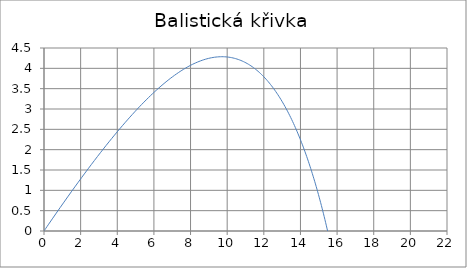
| Category | y |
|---|---|
| 0.0 | 0 |
| 0.23022917062329243 | 0.152 |
| 0.4541070226602385 | 0.299 |
| 0.671991292291787 | 0.44 |
| 0.8842103542382591 | 0.577 |
| 1.091066366301379 | 0.71 |
| 1.2928380016761116 | 0.839 |
| 1.4897828324782796 | 0.963 |
| 1.6821394167884418 | 1.083 |
| 1.8701291325561664 | 1.2 |
| 2.053957794468319 | 1.314 |
| 2.233817083998276 | 1.423 |
| 2.4098858180411296 | 1.53 |
| 2.5823310775866117 | 1.633 |
| 2.751309214617688 | 1.733 |
| 2.9169667527158323 | 1.831 |
| 3.0794411945990174 | 1.925 |
| 3.2388617479321256 | 2.017 |
| 3.3953499791651685 | 2.106 |
| 3.5490204038190356 | 2.192 |
| 3.699981020508245 | 2.276 |
| 3.8483337950304803 | 2.358 |
| 3.994175100035027 | 2.437 |
| 4.1375961150833644 | 2.514 |
| 4.2786831913159755 | 2.589 |
| 4.417518184424185 | 2.661 |
| 4.554178759181516 | 2.731 |
| 4.688738668404803 | 2.8 |
| 4.821268008882178 | 2.866 |
| 4.9518334565154625 | 2.93 |
| 5.08049848267215 | 2.993 |
| 5.20732355352181 | 3.053 |
| 5.332366313938749 | 3.112 |
| 5.455681757383505 | 3.169 |
| 5.577322383026915 | 3.224 |
| 5.697338341249322 | 3.277 |
| 5.815777568531718 | 3.329 |
| 5.932685912653217 | 3.379 |
| 6.048107249018476 | 3.428 |
| 6.162083588858102 | 3.474 |
| 6.274655179973434 | 3.52 |
| 6.385860600633203 | 3.564 |
| 6.495736847172645 | 3.606 |
| 6.604319415794664 | 3.647 |
| 6.711642379027082 | 3.686 |
| 6.817738457249125 | 3.724 |
| 6.922639085663589 | 3.76 |
| 7.026374477058126 | 3.796 |
| 7.1289736806693735 | 3.829 |
| 7.230464637436858 | 3.862 |
| 7.330874231909404 | 3.893 |
| 7.430228341044904 | 3.923 |
| 7.528551880124528 | 3.951 |
| 7.625868845984485 | 3.978 |
| 7.722202357752175 | 4.004 |
| 7.8175746952588065 | 4.029 |
| 7.912007335287051 | 4.053 |
| 8.005520985800116 | 4.075 |
| 8.09813561828741 | 4.096 |
| 8.189870498351814 | 4.116 |
| 8.280744214654243 | 4.135 |
| 8.370774706322694 | 4.152 |
| 8.459979288925165 | 4.169 |
| 8.548374679098695 | 4.184 |
| 8.635977017920204 | 4.198 |
| 8.722801893098856 | 4.211 |
| 8.808864360064012 | 4.223 |
| 8.894178962017898 | 4.234 |
| 8.978759749017268 | 4.244 |
| 9.062620296144118 | 4.253 |
| 9.145773720821454 | 4.26 |
| 9.228232699326412 | 4.267 |
| 9.310009482549631 | 4.273 |
| 9.391115911046565 | 4.277 |
| 9.471563429423492 | 4.281 |
| 9.551363100098222 | 4.284 |
| 9.630525616472967 | 4.285 |
| 9.70906131555443 | 4.286 |
| 9.786980190053978 | 4.285 |
| 9.864291899998642 | 4.284 |
| 9.941005783881812 | 4.282 |
| 10.017130869380583 | 4.278 |
| 10.092675883665091 | 4.274 |
| 10.167649263323483 | 4.269 |
| 10.24205916392472 | 4.263 |
| 10.315913469239948 | 4.256 |
| 10.38921980014185 | 4.247 |
| 10.461985523200108 | 4.239 |
| 10.534217758989909 | 4.229 |
| 10.605923390129332 | 4.218 |
| 10.677109069060304 | 4.206 |
| 10.747781225586898 | 4.194 |
| 10.817946074183716 | 4.18 |
| 10.887609621086224 | 4.166 |
| 10.956777671174043 | 4.151 |
| 11.025455834657416 | 4.135 |
| 11.09364953357624 | 4.118 |
| 11.16136400812043 | 4.1 |
| 11.228604322779606 | 4.081 |
| 11.295375372329529 | 4.062 |
| 11.36168188766205 | 4.041 |
| 11.427528441464847 | 4.02 |
| 11.49291945375663 | 3.998 |
| 11.557859197283022 | 3.975 |
| 11.622351802777914 | 3.951 |
| 11.686401264094597 | 3.927 |
| 11.750011443210635 | 3.901 |
| 11.81318607511007 | 3.875 |
| 11.8759287725462 | 3.848 |
| 11.938243030687897 | 3.821 |
| 12.00013223165215 | 3.792 |
| 12.061599648925261 | 3.763 |
| 12.122648451674893 | 3.733 |
| 12.183281708955016 | 3.702 |
| 12.243502393805565 | 3.67 |
| 12.3033133872485 | 3.638 |
| 12.362717482181809 | 3.605 |
| 12.421717387172922 | 3.571 |
| 12.480315730152826 | 3.536 |
| 12.538515062012175 | 3.501 |
| 12.596317860100566 | 3.464 |
| 12.65372653163012 | 3.427 |
| 12.710743416984473 | 3.39 |
| 12.767370792934221 | 3.352 |
| 12.823610875759908 | 3.312 |
| 12.879465824283532 | 3.273 |
| 12.93493774280968 | 3.232 |
| 12.990028683977258 | 3.191 |
| 13.044740651522915 | 3.149 |
| 13.099075602957205 | 3.106 |
| 13.153035452154578 | 3.063 |
| 13.206622071858297 | 3.019 |
| 13.259837296101422 | 2.975 |
| 13.312682922545013 | 2.929 |
| 13.365160714734747 | 2.883 |
| 13.417272404277155 | 2.837 |
| 13.469019692936719 | 2.789 |
| 13.520404254655134 | 2.742 |
| 13.571427737493993 | 2.693 |
| 13.622091765502256 | 2.644 |
| 13.67239794050985 | 2.594 |
| 13.722347843848778 | 2.543 |
| 13.771943038003146 | 2.492 |
| 13.821185068189521 | 2.441 |
| 13.87007546386909 | 2.388 |
| 13.918615740193044 | 2.335 |
| 13.966807399382693 | 2.282 |
| 14.014651932045807 | 2.228 |
| 14.062150818430627 | 2.173 |
| 14.109305529619137 | 2.118 |
| 14.156117528661035 | 2.062 |
| 14.202588271649965 | 2.005 |
| 14.248719208743514 | 1.948 |
| 14.294511785128485 | 1.891 |
| 14.33996744193298 | 1.833 |
| 14.385087617086782 | 1.774 |
| 14.429873746131562 | 1.715 |
| 14.474327262982385 | 1.655 |
| 14.518449600642018 | 1.595 |
| 14.562242191869505 | 1.534 |
| 14.605706469804476 | 1.472 |
| 14.64884386854862 | 1.41 |
| 14.691655823705787 | 1.348 |
| 14.73414377288208 | 1.285 |
| 14.776309156147375 | 1.222 |
| 14.818153416459635 | 1.158 |
| 14.859678000053346 | 1.093 |
| 14.900884356793439 | 1.028 |
| 14.941773940495985 | 0.963 |
| 14.982348209216964 | 0.897 |
| 15.022608625510372 | 0.831 |
| 15.062556656656884 | 0.764 |
| 15.102193774864313 | 0.697 |
| 15.141521457441034 | 0.629 |
| 15.180541186943552 | 0.561 |
| 15.219254451299339 | 0.492 |
| 15.257662743906053 | 0.423 |
| 15.295767563708223 | 0.354 |
| 15.333570415252465 | 0.284 |
| 15.37107280872225 | 0.214 |
| 15.408276259953238 | 0.143 |
| 15.445182290430148 | 0.072 |
| 15.481792427266113 | 0 |
| 15.518108203165465 | -0.072 |
| 15.554131156370815 | -0.144 |
| 15.589862830595333 | -0.217 |
| 15.625304774941052 | -0.29 |
| 15.66045854380403 | -0.364 |
| 15.695325696767151 | -0.438 |
| 15.729907798481348 | -0.512 |
| 15.76420641853598 | -0.587 |
| 15.798223131319109 | -0.662 |
| 15.831959515868318 | -0.737 |
| 15.865417155712818 | -0.813 |
| 15.898597638707416 | -0.889 |
| 15.931502556859026 | -0.966 |
| 15.964133506146293 | -1.043 |
| 15.99649208633292 | -1.12 |
| 16.028579900775252 | -1.197 |
| 16.060398556224673 | -1.275 |
| 16.091949662625286 | -1.353 |
| 16.12323483290743 | -1.432 |
| 16.15425568277745 | -1.511 |
| 16.18501383050422 | -1.59 |
| 16.215510896702835 | -1.669 |
| 16.245748504115866 | -1.749 |
| 16.275728277392645 | -1.829 |
| 16.30545184286687 | -1.909 |
| 16.334920828332955 | -1.99 |
| 16.36413686282147 | -2.071 |
| 16.393101576373972 | -2.152 |
| 16.42181659981753 | -2.233 |
| 16.450283564539298 | -2.315 |
| 16.47850410226138 | -2.397 |
| 16.506479844816237 | -2.479 |
| 16.534212423922945 | -2.562 |
| 16.561703470964478 | -2.645 |
| 16.588954616766316 | -2.728 |
| 16.615967491376505 | -2.811 |
| 16.64274372384746 | -2.895 |
| 16.66928494201963 | -2.979 |
| 16.695592772307236 | -3.063 |
| 16.72166883948625 | -3.147 |
| 16.74751476648475 | -3.232 |
| 16.7731321741758 | -3.316 |
| 16.798522681173026 | -3.401 |
| 16.82368790362894 | -3.487 |
| 16.84862945503621 | -3.572 |
| 16.873348946031907 | -3.658 |
| 16.897847984204894 | -3.744 |
| 16.922128173906387 | -3.83 |
| 16.946191116063805 | -3.916 |
| 16.970038407997983 | -4.003 |
| 16.99367164324378 | -4.089 |
| 17.017092411374186 | -4.176 |
| 17.040302297827957 | -4.263 |
| 17.063302883740807 | -4.351 |
| 17.08609574578024 | -4.438 |
| 17.10868245598402 | -4.526 |
| 17.13106458160231 | -4.614 |
| 17.153243684943522 | -4.702 |
| 17.17522132322388 | -4.79 |
| 17.196999048420714 | -4.879 |
| 17.2185784071295 | -4.967 |
| 17.239960940424613 | -5.056 |
| 17.261148183723858 | -5.145 |
| 17.28214166665672 | -5.234 |
| 17.302942912936338 | -5.324 |
| 17.32355344023521 | -5.413 |
| 17.343974760064583 | -5.503 |
| 17.36420837765755 | -5.592 |
| 17.38425579185579 | -5.682 |
| 17.404118494999945 | -5.772 |
| 17.423797972823635 | -5.863 |
| 17.443295704351037 | -5.953 |
| 17.462613161798007 | -6.044 |
| 17.481751810476762 | -6.134 |
| 17.50071310870399 | -6.225 |
| 17.519498507712463 | -6.316 |
| 17.538109451566008 | -6.407 |
| 17.556547377077894 | -6.498 |
| 17.574813713732514 | -6.59 |
| 17.592909883610346 | -6.681 |
| 17.61083730131618 | -6.773 |
| 17.628597373910527 | -6.864 |
| 17.646191500844147 | -6.956 |
| 17.663621073895733 | -7.048 |
| 17.680887477112595 | -7.14 |
| 17.697992086754375 | -7.233 |
| 17.71493627123971 | -7.325 |
| 17.731721391095785 | -7.417 |
| 17.74834879891077 | -7.51 |
| 17.764819839289014 | -7.603 |
| 17.78113584880904 | -7.695 |
| 17.797298155984205 | -7.788 |
| 17.813308081226015 | -7.881 |
| 17.829166936810058 | -7.974 |
| 17.84487602684444 | -8.068 |
| 17.86043664724076 | -8.161 |
| 17.8758500856875 | -8.254 |
| 17.891117621625813 | -8.348 |
| 17.90624052622765 | -8.441 |
| 17.921220062376158 | -8.535 |
| 17.936057484648362 | -8.629 |
| 17.950754039299973 | -8.723 |
| 17.96531096425237 | -8.817 |
| 17.97972948908167 | -8.911 |
| 17.994010835009796 | -9.005 |
| 18.008156214897586 | -9.099 |
| 18.022166833239794 | -9.193 |
| 18.036043886162016 | -9.288 |
| 18.049788561419422 | -9.382 |
| 18.063402038397324 | -9.477 |
| 18.07688548811345 | -9.571 |
| 18.09024007322196 | -9.666 |
| 18.103466948019076 | -9.761 |
| 18.11656725845036 | -9.856 |
| 18.12954214211954 | -9.951 |
| 18.14239272829885 | -10.046 |
| 18.15512013794088 | -10.141 |
| 18.167725483691818 | -10.236 |
| 18.180209869906125 | -10.331 |
| 18.19257439266255 | -10.426 |
| 18.204820139781432 | -10.521 |
| 18.216948190843326 | -10.617 |
| 18.2289596172088 | -10.712 |
| 18.240855482039482 | -10.808 |
| 18.25263684032021 | -10.903 |
| 18.264304738882352 | -10.999 |
| 18.275860216428153 | -11.095 |
| 18.287304303556173 | -11.191 |
| 18.298638022787706 | -11.286 |
| 18.309862388594183 | -11.382 |
| 18.320978407425507 | -11.478 |
| 18.331987077739306 | -11.574 |
| 18.342889390031054 | -11.67 |
| 18.353686326865024 | -11.766 |
| 18.364378862906072 | -11.862 |
| 18.374967964952173 | -11.959 |
| 18.385454591967726 | -12.055 |
| 18.395839695117576 | -12.151 |
| 18.40612421780171 | -12.247 |
| 18.41630909569063 | -12.344 |
| 18.42639525676135 | -12.44 |
| 18.436383621334006 | -12.537 |
| 18.446275102109052 | -12.633 |
| 18.45607060420498 | -12.73 |
| 18.465771025196617 | -12.827 |
| 18.475377255153866 | -12.923 |
| 18.48489017668099 | -13.02 |
| 18.4943106649563 | -13.117 |
| 18.503639587772298 | -13.213 |
| 18.51287780557624 | -13.31 |
| 18.522026171511072 | -13.407 |
| 18.53108553145673 | -13.504 |
| 18.540056724071796 | -13.601 |
| 18.548940580835485 | -13.698 |
| 18.557737926089924 | -13.795 |
| 18.566449577082725 | -13.892 |
| 18.57507634400982 | -13.989 |
| 18.583619030058554 | -14.086 |
| 18.592078431451014 | -14.183 |
| 18.600455337487556 | -14.28 |
| 18.608750530590537 | -14.378 |
| 18.616964786348227 | -14.475 |
| 18.625098873558898 | -14.572 |
| 18.633153554275047 | -14.67 |
| 18.641129583847757 | -14.767 |
| 18.64902771097118 | -14.864 |
| 18.656848677727123 | -14.962 |
| 18.664593219629744 | -15.059 |
| 18.67226206567028 | -15.157 |
| 18.679855938361907 | -15.254 |
| 18.687375553784584 | -15.352 |
| 18.69482162162998 | -15.449 |
| 18.702194845246428 | -15.547 |
| 18.70949592168387 | -15.644 |
| 18.71672554173884 | -15.742 |
| 18.72388438999941 | -15.84 |
| 18.730973144890143 | -15.937 |
| 18.73799247871702 | -16.035 |
| 18.7449430577123 | -16.133 |
| 18.7518255420794 | -16.23 |
| 18.75864058603762 | -16.328 |
| 18.765388837866926 | -16.426 |
| 18.772070939952552 | -16.524 |
| 18.7786875288296 | -16.622 |
| 18.785239235227497 | -16.719 |
| 18.791726684114384 | -16.817 |
| 18.79815049474141 | -16.915 |
| 18.80451128068688 | -17.013 |
| 18.810809649900328 | -17.111 |
| 18.817046204746422 | -17.209 |
| 18.82322154204878 | -17.307 |
| 18.829336253133622 | -17.405 |
| 18.835390923873273 | -17.503 |
| 18.841386134729547 | -17.601 |
| 18.84732246079695 | -17.699 |
| 18.853200471845735 | -17.797 |
| 18.859020732364794 | -17.895 |
| 18.864783801604364 | -17.993 |
| 18.870490233618586 | -18.092 |
| 18.87614057730785 | -18.19 |
| 18.881735376461 | -18.288 |
| 18.887275169797302 | -18.386 |
| 18.892760491008268 | -18.484 |
| 18.898191868799255 | -18.582 |
| 18.90356982693087 | -18.681 |
| 18.908894884260178 | -18.779 |
| 18.91416755478171 | -18.877 |
| 18.919388347668246 | -18.975 |
| 18.92455776731141 | -19.074 |
| 18.929676313362016 | -19.172 |
| 18.934744480770245 | -19.27 |
| 18.939762759825552 | -19.369 |
| 18.944731636196384 | -19.467 |
| 18.94965159096967 | -19.565 |
| 18.954523100690075 | -19.664 |
| 18.95934663739904 | -19.762 |
| 18.964122668673568 | -19.86 |
| 18.968851657664807 | -19.959 |
| 18.973534063136377 | -20.057 |
| 18.978170339502473 | -20.156 |
| 18.982760936865745 | -20.254 |
| 18.9873063010549 | -20.352 |
| 18.991806873662117 | -20.451 |
| 18.99626309208018 | -20.549 |
| 19.000675389539396 | -20.648 |
| 19.005044195144247 | -20.746 |
| 19.00936993390984 | -20.845 |
| 19.013653026798075 | -20.943 |
| 19.017893890753566 | -21.042 |
| 19.022092938739366 | -21.14 |
| 19.026250579772395 | -21.239 |
| 19.03036721895865 | -21.337 |
| 19.034443257528153 | -21.436 |
| 19.03847909286969 | -21.534 |
| 19.042475118565235 | -21.633 |
| 19.046431724424213 | -21.732 |
| 19.05034929651744 | -21.83 |
| 19.05422821721087 | -21.929 |
| 19.05806886519907 | -22.027 |
| 19.061871615538447 | -22.126 |
| 19.065636839680263 | -22.225 |
| 19.06936490550335 | -22.323 |
| 19.073056177346626 | -22.422 |
| 19.07671101604134 | -22.521 |
| 19.080329778943096 | -22.619 |
| 19.083912819963604 | -22.718 |
| 19.087460489602204 | -22.816 |
| 19.09097313497716 | -22.915 |
| 19.09445109985667 | -23.014 |
| 19.097894724689695 | -23.113 |
| 19.10130434663649 | -23.211 |
| 19.10468029959891 | -23.31 |
| 19.108022914250515 | -23.409 |
| 19.111332518066384 | -23.507 |
| 19.114609435352705 | -23.606 |
| 19.117853987276163 | -23.705 |
| 19.121066491893032 | -23.803 |
| 19.124247264178088 | -23.902 |
| 19.12739661605325 | -24.001 |
| 19.130514856416 | -24.1 |
| 19.133602291167577 | -24.198 |
| 19.136659223240926 | -24.297 |
| 19.139685952628433 | -24.396 |
| 19.142682776409405 | -24.495 |
| 19.145649988777354 | -24.593 |
| 19.14858788106703 | -24.692 |
| 19.15149674178124 | -24.791 |
| 19.15437685661742 | -24.89 |
| 19.157228508494025 | -24.989 |
| 19.160051977576646 | -25.087 |
| 19.162847541303957 | -25.186 |
| 19.165615474413393 | -25.285 |
| 19.16835604896664 | -25.384 |
| 19.171069534374897 | -25.483 |
| 19.173756197423927 | -25.581 |
| 19.176416302298875 | -25.68 |
| 19.179050110608905 | -25.779 |
| 19.18165788141159 | -25.878 |
| 19.184239871237097 | -25.977 |
| 19.186796334112188 | -26.076 |
| 19.189327521583984 | -26.174 |
| 19.19183368274352 | -26.273 |
| 19.19431506424913 | -26.372 |
| 19.19677191034956 | -26.471 |
| 19.199204462906966 | -26.57 |
| 19.201612961419617 | -26.669 |
| 19.20399764304447 | -26.768 |
| 19.206358742619507 | -26.866 |
| 19.208696492685885 | -26.965 |
| 19.21101112350988 | -27.064 |
| 19.213302863104655 | -27.163 |
| 19.215571937251806 | -27.262 |
| 19.21781856952274 | -27.361 |
| 19.22004298129985 | -27.46 |
| 19.2222453917975 | -27.559 |
| 19.224426018082816 | -27.657 |
| 19.226585075096306 | -27.756 |
| 19.228722775672278 | -27.855 |
| 19.230839330559075 | -27.954 |
| 19.232934948439137 | -28.053 |
| 19.23500983594887 | -28.152 |
| 19.23706419769833 | -28.251 |
| 19.239098236290754 | -28.35 |
| 19.24111215234188 | -28.449 |
| 19.24310614449911 | -28.548 |
| 19.24508040946049 | -28.646 |
| 19.247035141993514 | -28.745 |
| 19.248970534953777 | -28.844 |
| 19.250886779303425 | -28.943 |
| 19.252784064129447 | -29.042 |
| 19.254662576661808 | -29.141 |
| 19.25652250229141 | -29.24 |
| 19.258364024587877 | -29.339 |
| 19.260187325317183 | -29.438 |
| 19.26199258445913 | -29.537 |
| 19.263779980224633 | -29.636 |
| 19.265549689072866 | -29.735 |
| 19.26730188572825 | -29.834 |
| 19.269036743197283 | -29.933 |
| 19.270754432785182 | -30.031 |
| 19.27245512411242 | -30.13 |
| 19.274138985131078 | -30.229 |
| 19.27580618214104 | -30.328 |
| 19.277456879806056 | -30.427 |
| 19.27909124116964 | -30.526 |
| 19.280709427670818 | -30.625 |
| 19.282311599159748 | -30.724 |
| 19.28389791391316 | -30.823 |
| 19.285468528649687 | -30.922 |
| 19.287023598545016 | -31.021 |
| 19.28856327724693 | -31.12 |
| 19.290087716890177 | -31.219 |
| 19.29159706811123 | -31.318 |
| 19.293091480062873 | -31.417 |
| 19.29457110042868 | -31.516 |
| 19.296036075437343 | -31.615 |
| 19.29748654987685 | -31.714 |
| 19.29892266710857 | -31.813 |
| 19.300344569081155 | -31.912 |
| 19.301752396344337 | -32.011 |
| 19.303146288062603 | -32.11 |
| 19.30452638202871 | -32.209 |
| 19.305892814677097 | -32.308 |
| 19.307245721097164 | -32.407 |
| 19.3085852350464 | -32.506 |
| 19.309911488963436 | -32.605 |
| 19.31122461398092 | -32.704 |
| 19.312524739938294 | -32.803 |
| 19.31381199539447 | -32.902 |
| 19.315086507640338 | -33.001 |
| 19.316348402711185 | -33.1 |
| 19.317597805398993 | -33.199 |
| 19.31883483926461 | -33.298 |
| 19.32005962664981 | -33.397 |
| 19.321272288689244 | -33.496 |
| 19.322472945322247 | -33.595 |
| 19.323661715304574 | -33.694 |
| 19.32483871622 | -33.793 |
| 19.326004064491798 | -33.892 |
| 19.327157875394132 | -33.991 |
| 19.328300263063316 | -34.09 |
| 19.32943134050899 | -34.189 |
| 19.330551219625157 | -34.288 |
| 19.331660011201144 | -34.387 |
| 19.332757824932447 | -34.486 |
| 19.33384476943145 | -34.585 |
| 19.334920952238082 | -34.684 |
| 19.335986479830325 | -34.783 |
| 19.33704145763466 | -34.882 |
| 19.33808599003639 | -34.981 |
| 19.339120180389873 | -35.08 |
| 19.340144131028637 | -35.179 |
| 19.34115794327543 | -35.278 |
| 19.342161717452143 | -35.377 |
| 19.343155552889648 | -35.476 |
| 19.34413954793755 | -35.575 |
| 19.345113799973824 | -35.674 |
| 19.34607840541437 | -35.773 |
| 19.34703345972249 | -35.872 |
| 19.347979057418236 | -35.971 |
| 19.34891529208771 | -36.07 |
| 19.34984225639224 | -36.169 |
| 19.35076004207747 | -36.268 |
| 19.351668739982404 | -36.367 |
| 19.35256844004829 | -36.466 |
| 19.35345923132749 | -36.565 |
| 19.35434120199221 | -36.664 |
| 19.355214439343165 | -36.763 |
| 19.356079029818176 | -36.862 |
| 19.356935059000655 | -36.961 |
| 19.35778261162802 | -37.06 |
| 19.35862177160003 | -37.159 |
| 19.359452621987046 | -37.258 |
| 19.360275245038174 | -37.357 |
| 19.361089722189394 | -37.456 |
| 19.36189613407154 | -37.555 |
| 19.362694560518246 | -37.654 |
| 19.363485080573817 | -37.753 |
| 19.364267772500988 | -37.852 |
| 19.365042713788625 | -37.951 |
| 19.365809981159376 | -38.05 |
| 19.366569650577215 | -38.149 |
| 19.367321797254906 | -38.248 |
| 19.368066495661438 | -38.347 |
| 19.368803819529337 | -38.446 |
| 19.369533841861944 | -38.545 |
| 19.370256634940592 | -38.644 |
| 19.37097227033174 | -38.743 |
| 19.371680818894028 | -38.842 |
| 19.372382350785237 | -38.941 |
| 19.37307693546923 | -39.04 |
| 19.37376464172278 | -39.139 |
| 19.374445537642362 | -39.238 |
| 19.375119690650855 | -39.337 |
| 19.375787167504196 | -39.436 |
| 19.376448034297965 | -39.535 |
| 19.37710235647389 | -39.634 |
| 19.37775019882632 | -39.733 |
| 19.37839162550859 | -39.832 |
| 19.37902670003938 | -39.932 |
| 19.379655485308948 | -40.031 |
| 19.380278043585356 | -40.13 |
| 19.380894436520602 | -40.229 |
| 19.381504725156717 | -40.328 |
| 19.38210896993177 | -40.427 |
| 19.38270723068585 | -40.526 |
| 19.38329956666695 | -40.625 |
| 19.383886036536836 | -40.724 |
| 19.384466698376823 | -40.823 |
| 19.38504160969351 | -40.922 |
| 19.38561082742447 | -41.021 |
| 19.386174407943848 | -41.12 |
| 19.386732407067953 | -41.219 |
| 19.38728488006074 | -41.318 |
| 19.387831881639293 | -41.417 |
| 19.38837346597921 | -41.516 |
| 19.388909686719963 | -41.615 |
| 19.389440596970193 | -41.714 |
| 19.389966249312955 | -41.813 |
| 19.39048669581091 | -41.912 |
| 19.39100198801147 | -42.011 |
| 19.39151217695189 | -42.11 |
| 19.3920173131643 | -42.209 |
| 19.39251744668072 | -42.308 |
| 19.393012627037983 | -42.407 |
| 19.393502903282627 | -42.506 |
| 19.393988323975762 | -42.605 |
| 19.39446893719785 | -42.704 |
| 19.39494479055346 | -42.803 |
| 19.395415931175982 | -42.903 |
| 19.39588240573227 | -43.002 |
| 19.396344260427263 | -43.101 |
| 19.396801541008557 | -43.2 |
| 19.397254292770914 | -43.299 |
| 19.397702560560745 | -43.398 |
| 19.398146388780553 | -43.497 |
| 19.3985858213933 | -43.596 |
| 19.399020901926775 | -43.695 |
| 19.399451673477884 | -43.794 |
| 19.399878178716918 | -43.893 |
| 19.400300459891763 | -43.992 |
| 19.400718558832093 | -44.091 |
| 19.401132516953485 | -44.19 |
| 19.401542375261535 | -44.289 |
| 19.401948174355894 | -44.388 |
| 19.4023499544343 | -44.487 |
| 19.40274775529654 | -44.586 |
| 19.4031416163484 | -44.685 |
| 19.40353157660554 | -44.784 |
| 19.40391767469738 | -44.883 |
| 19.404299948870893 | -44.982 |
| 19.404678436994416 | -45.081 |
| 19.40505317656137 | -45.18 |
| 19.405424204693986 | -45.279 |
| 19.40579155814697 | -45.378 |
| 19.40615527331114 | -45.478 |
| 19.406515386217023 | -45.577 |
| 19.40687193253843 | -45.676 |
| 19.40722494759597 | -45.775 |
| 19.407574466360554 | -45.874 |
| 19.407920523456855 | -45.973 |
| 19.40826315316673 | -46.072 |
| 19.40860238943261 | -46.171 |
| 19.408938265860865 | -46.27 |
| 19.409270815725126 | -46.369 |
| 19.409600071969578 | -46.468 |
| 19.40992606721222 | -46.567 |
| 19.41024883374808 | -46.666 |
| 19.410568403552446 | -46.765 |
| 19.41088480828398 | -46.864 |
| 19.411198079287892 | -46.963 |
| 19.41150824759903 | -47.062 |
| 19.41181534394494 | -47.161 |
| 19.412119398748924 | -47.26 |
| 19.412420442133033 | -47.359 |
| 19.412718503921067 | -47.458 |
| 19.413013613641517 | -47.557 |
| 19.413305800530484 | -47.656 |
| 19.41359509353458 | -47.755 |
| 19.413881521313787 | -47.855 |
| 19.4141651122443 | -47.954 |
| 19.414445894421338 | -48.053 |
| 19.414723895661904 | -48.152 |
| 19.414999143507565 | -48.251 |
| 19.415271665227166 | -48.35 |
| 19.41554148781953 | -48.449 |
| 19.415808638016134 | -48.548 |
| 19.41607314228375 | -48.647 |
| 19.416335026827067 | -48.746 |
| 19.416594317591283 | -48.845 |
| 19.41685104026468 | -48.944 |
| 19.41710522028117 | -49.043 |
| 19.41735688282279 | -49.142 |
| 19.417606052822222 | -49.241 |
| 19.417852754965253 | -49.34 |
| 19.41809701369321 | -49.439 |
| 19.418338853205395 | -49.538 |
| 19.418578297461462 | -49.637 |
| 19.418815370183804 | -49.736 |
| 19.4190500948599 | -49.835 |
| 19.419282494744635 | -49.934 |
| 19.41951259286261 | -50.033 |
| 19.419740412010412 | -50.132 |
| 19.41996597475888 | -50.232 |
| 19.420189303455338 | -50.331 |
| 19.420410420225796 | -50.43 |
| 19.420629346977165 | -50.529 |
| 19.42084610539941 | -50.628 |
| 19.421060716967688 | -50.727 |
| 19.421273202944494 | -50.826 |
| 19.421483584381768 | -50.925 |
| 19.421691882122953 | -51.024 |
| 19.421898116805092 | -51.123 |
| 19.422102308860854 | -51.222 |
| 19.42230447852055 | -51.321 |
| 19.422504645814158 | -51.42 |
| 19.422702830573286 | -51.519 |
| 19.42289905243315 | -51.618 |
| 19.423093330834508 | -51.717 |
| 19.423285685025597 | -51.816 |
| 19.42347613406403 | -51.915 |
| 19.42366469681868 | -52.014 |
| 19.423851391971567 | -52.113 |
| 19.424036238019685 | -52.212 |
| 19.424219253276853 | -52.311 |
| 19.42440045587551 | -52.411 |
| 19.424579863768532 | -52.51 |
| 19.42475749473099 | -52.609 |
| 19.424933366361927 | -52.708 |
| 19.425107496086092 | -52.807 |
| 19.42527990115567 | -52.906 |
| 19.425450598651977 | -53.005 |
| 19.425619605487178 | -53.104 |
| 19.42578693840594 | -53.203 |
| 19.425952613987093 | -53.302 |
| 19.426116648645284 | -53.401 |
| 19.426279058632595 | -53.5 |
| 19.426439860040144 | -53.599 |
| 19.426599068799703 | -53.698 |
| 19.426756700685246 | -53.797 |
| 19.426912771314537 | -53.896 |
| 19.42706729615066 | -53.995 |
| 19.42722029050356 | -54.094 |
| 19.427371769531554 | -54.193 |
| 19.427521748242835 | -54.292 |
| 19.427670241496962 | -54.391 |
| 19.427817264006325 | -54.49 |
| 19.427962830337602 | -54.589 |
| 19.42810695491321 | -54.689 |
| 19.42824965201273 | -54.788 |
| 19.428390935774313 | -54.887 |
| 19.428530820196094 | -54.986 |
| 19.428669319137573 | -55.085 |
| 19.428806446320984 | -55.184 |
| 19.428942215332658 | -55.283 |
| 19.42907663962437 | -55.382 |
| 19.429209732514664 | -55.481 |
| 19.429341507190188 | -55.58 |
| 19.429471976706985 | -55.679 |
| 19.429601153991786 | -55.778 |
| 19.429729051843307 | -55.877 |
| 19.4298556829335 | -55.976 |
| 19.42998105980881 | -56.075 |
| 19.43010519489143 | -56.174 |
| 19.43022810048052 | -56.273 |
| 19.43034978875343 | -56.372 |
| 19.430470271766904 | -56.471 |
| 19.430589561458273 | -56.57 |
| 19.430707669646647 | -56.669 |
| 19.430824608034076 | -56.768 |
| 19.430940388206707 | -56.868 |
| 19.431055021635945 | -56.967 |
| 19.431168519679577 | -57.066 |
| 19.4312808935829 | -57.165 |
| 19.43139215447984 | -57.264 |
| 19.43150231339405 | -57.363 |
| 19.43161138124 | -57.462 |
| 19.431719368824073 | -57.561 |
| 19.43182628684561 | -57.66 |
| 19.431932145897992 | -57.759 |
| 19.43203695646968 | -57.858 |
| 19.43214072894526 | -57.957 |
| 19.432243473606462 | -58.056 |
| 19.432345200633183 | -58.155 |
| 19.432445920104495 | -58.254 |
| 19.432545641999656 | -58.353 |
| 19.432644376199082 | -58.452 |
| 19.432742132485323 | -58.551 |
| 19.432838920544054 | -58.65 |
| 19.43293474996501 | -58.749 |
| 19.43302963024296 | -58.848 |
| 19.433123570778616 | -58.947 |
| 19.433216580879602 | -59.046 |
| 19.43330866976135 | -59.146 |
| 19.43339984654801 | -59.245 |
| 19.433490120273383 | -59.344 |
| 19.433579499881784 | -59.443 |
| 19.433667994228944 | -59.542 |
| 19.433755612082887 | -59.641 |
| 19.433842362124793 | -59.74 |
| 19.433928252949865 | -59.839 |
| 19.434013293068176 | -59.938 |
| 19.434097490905508 | -60.037 |
| 19.434180854804197 | -60.136 |
| 19.43426339302395 | -60.235 |
| 19.434345113742676 | -60.334 |
| 19.434426025057274 | -60.433 |
| 19.43450613498446 | -60.532 |
| 19.434585451461544 | -60.631 |
| 19.434663982347224 | -60.73 |
| 19.434741735422367 | -60.829 |
| 19.434818718390765 | -60.928 |
| 19.434894938879925 | -61.027 |
| 19.434970404441795 | -61.126 |
| 19.435045122553532 | -61.225 |
| 19.435119100618234 | -61.325 |
| 19.43519234596568 | -61.424 |
| 19.435264865853053 | -61.523 |
| 19.435336667465652 | -61.622 |
| 19.435407757917616 | -61.721 |
| 19.435478144252617 | -61.82 |
| 19.435547833444573 | -61.919 |
| 19.43561683239832 | -62.018 |
| 19.435685147950316 | -62.117 |
| 19.4357527868693 | -62.216 |
| 19.435819755856972 | -62.315 |
| 19.43588606154866 | -62.414 |
| 19.43595171051397 | -62.513 |
| 19.43601670925744 | -62.612 |
| 19.436081064219188 | -62.711 |
| 19.436144781775543 | -62.81 |
| 19.43620786823968 | -62.909 |
| 19.436270329862246 | -63.008 |
| 19.436332172831985 | -63.107 |
| 19.436393403276337 | -63.206 |
| 19.43645402726206 | -63.305 |
| 19.436514050795818 | -63.404 |
| 19.436573479824787 | -63.504 |
| 19.43663232023724 | -63.603 |
| 19.436690577863125 | -63.702 |
| 19.436748258474655 | -63.801 |
| 19.43680536778687 | -63.9 |
| 19.4368619114582 | -63.999 |
| 19.436917895091046 | -64.098 |
| 19.4369733242323 | -64.197 |
| 19.43702820437393 | -64.296 |
| 19.437082540953504 | -64.395 |
| 19.43713633935474 | -64.494 |
| 19.437189604908028 | -64.593 |
| 19.437242342890958 | -64.692 |
| 19.43729455852886 | -64.791 |
| 19.4373462569953 | -64.89 |
| 19.437397443412618 | -64.989 |
| 19.4374481228524 | -65.088 |
| 19.43749830033601 | -65.187 |
| 19.437547980835078 | -65.286 |
| 19.437597169271996 | -65.385 |
| 19.437645870520402 | -65.484 |
| 19.437694089405657 | -65.583 |
| 19.437741830705335 | -65.683 |
| 19.43778909914969 | -65.782 |
| 19.43783589942212 | -65.881 |
| 19.437882236159645 | -65.98 |
| 19.43792811395335 | -66.079 |
| 19.437973537348856 | -66.178 |
| 19.438018510846753 | -66.277 |
| 19.438063038903064 | -66.376 |
| 19.43810712592967 | -66.475 |
| 19.43815077629476 | -66.574 |
| 19.43819399432325 | -66.673 |
| 19.43823678429723 | -66.772 |
| 19.438279150456378 | -66.871 |
| 19.438321096998372 | -66.97 |
| 19.438362628079318 | -67.069 |
| 19.438403747814164 | -67.168 |
| 19.438444460277093 | -67.267 |
| 19.43848476950194 | -67.366 |
| 19.438524679482583 | -67.465 |
| 19.438564194173345 | -67.564 |
| 19.438603317489385 | -67.663 |
| 19.438642053307085 | -67.762 |
| 19.438680405464428 | -67.862 |
| 19.43871837776139 | -67.961 |
| 19.43875597396031 | -68.06 |
| 19.438793197786254 | -68.159 |
| 19.438830052927404 | -68.258 |
| 19.438866543035406 | -68.357 |
| 19.438902671725742 | -68.456 |
| 19.43893844257808 | -68.555 |
| 19.43897385913664 | -68.654 |
| 19.439008924910535 | -68.753 |
| 19.439043643374113 | -68.852 |
| 19.439078017967326 | -68.951 |
| 19.439112052096046 | -69.05 |
| 19.439145749132415 | -69.149 |
| 19.43917911241517 | -69.248 |
| 19.439212145249986 | -69.347 |
| 19.439244850909795 | -69.446 |
| 19.43927723263511 | -69.545 |
| 19.439309293634352 | -69.644 |
| 19.43934103708416 | -69.743 |
| 19.439372466129708 | -69.842 |
| 19.439403583885028 | -69.941 |
| 19.4394343934333 | -70.041 |
| 19.439464897827172 | -70.14 |
| 19.439495100089058 | -70.239 |
| 19.439525003211433 | -70.338 |
| 19.43955461015713 | -70.437 |
| 19.439583923859647 | -70.536 |
| 19.439612947223413 | -70.635 |
| 19.439641683124105 | -70.734 |
| 19.439670134408903 | -70.833 |
| 19.439698303896797 | -70.932 |
| 19.439726194378856 | -71.031 |
| 19.4397538086185 | -71.13 |
| 19.439781149351788 | -71.229 |
| 19.439808219287666 | -71.328 |
| 19.439835021108255 | -71.427 |
| 19.43986155746912 | -71.526 |
| 19.439887830999506 | -71.625 |
| 19.439913844302634 | -71.724 |
| 19.43993959995593 | -71.823 |
| 19.4399651005113 | -71.922 |
| 19.439990348495368 | -72.021 |
| 19.440015346409734 | -72.12 |
| 19.44004009673122 | -72.22 |
| 19.440064601912123 | -72.319 |
| 19.440088864380446 | -72.418 |
| 19.440112886540142 | -72.517 |
| 19.44013667077136 | -72.616 |
| 19.44016021943067 | -72.715 |
| 19.4401835348513 | -72.814 |
| 19.440206619343375 | -72.913 |
| 19.440229475194133 | -73.012 |
| 19.44025210466816 | -73.111 |
| 19.440274510007615 | -73.21 |
| 19.440296693432444 | -73.309 |
| 19.44031865714061 | -73.408 |
| 19.440340403308305 | -73.507 |
| 19.440361934090166 | -73.606 |
| 19.440383251619494 | -73.705 |
| 19.440404358008454 | -73.804 |
| 19.44042525534829 | -73.903 |
| 19.440445945709545 | -74.002 |
| 19.44046643114224 | -74.101 |
| 19.4404867136761 | -74.2 |
| 19.440506795320747 | -74.299 |
| 19.44052667806589 | -74.399 |
| 19.44054636388154 | -74.498 |
| 19.44056585471819 | -74.597 |
| 19.440585152507023 | -74.696 |
| 19.440604259160086 | -74.795 |
| 19.440623176570487 | -74.894 |
| 19.44064190661259 | -74.993 |
| 19.440660451142197 | -75.092 |
| 19.440678811996715 | -75.191 |
| 19.440696990995367 | -75.29 |
| 19.440714989939348 | -75.389 |
| 19.440732810612023 | -75.488 |
| 19.440750454779078 | -75.587 |
| 19.440767924188727 | -75.686 |
| 19.440785220571858 | -75.785 |
| 19.44080234564222 | -75.884 |
| 19.44081930109659 | -75.983 |
| 19.44083608861493 | -76.082 |
| 19.44085270986057 | -76.181 |
| 19.440869166480375 | -76.28 |
| 19.440885460104877 | -76.379 |
| 19.440901592348474 | -76.478 |
| 19.44091756480957 | -76.578 |
| 19.44093337907074 | -76.677 |
| 19.44094903669887 | -76.776 |
| 19.440964539245353 | -76.875 |
| 19.44097988824619 | -76.974 |
| 19.440995085222188 | -77.073 |
| 19.44101013167908 | -77.172 |
| 19.441025029107685 | -77.271 |
| 19.441039778984067 | -77.37 |
| 19.44105438276966 | -77.469 |
| 19.441068841911424 | -77.568 |
| 19.441083157841994 | -77.667 |
| 19.441097331979808 | -77.766 |
| 19.44111136572926 | -77.865 |
| 19.44112526048083 | -77.964 |
| 19.44113901761123 | -78.063 |
| 19.441152638483533 | -78.162 |
| 19.441166124447317 | -78.261 |
| 19.441179476838784 | -78.36 |
| 19.44119269698091 | -78.459 |
| 19.441205786183563 | -78.558 |
| 19.44121874574364 | -78.657 |
| 19.441231576945192 | -78.757 |
| 19.441244281059546 | -78.856 |
| 19.441256859345447 | -78.955 |
| 19.441269313049165 | -79.054 |
| 19.441281643404633 | -79.153 |